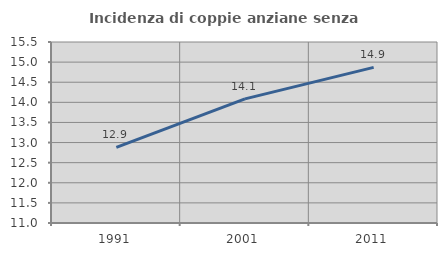
| Category | Incidenza di coppie anziane senza figli  |
|---|---|
| 1991.0 | 12.882 |
| 2001.0 | 14.086 |
| 2011.0 | 14.869 |